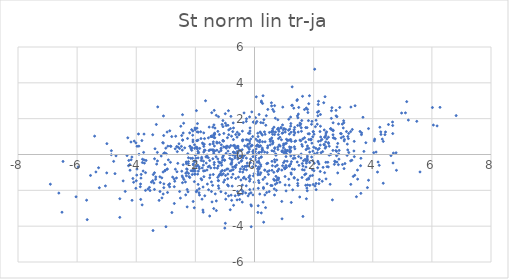
| Category | Series 0 |
|---|---|
| -3.0926707994987526 | -0.978 |
| -0.9162749100665515 | 0.935 |
| 0.9966999486311909 | 1.448 |
| 1.2450843050458609 | -1.098 |
| 0.9362940258760277 | 1.183 |
| 3.1901586718487014 | 0.109 |
| -1.0965026487906275 | 1.675 |
| 0.7906719478996074 | -0.895 |
| 1.744740184185364 | 0.271 |
| -4.068940276454976 | 0.749 |
| -2.081401741169082 | 0.704 |
| -2.1785153347138237 | 0.457 |
| 2.659842788497656 | 1.325 |
| 2.8475419634478856 | 0.032 |
| -0.801776660384526 | 0.498 |
| -2.8710928835645593 | -1.637 |
| 0.29314118956790214 | 1.766 |
| 2.418532799355688 | 0.43 |
| -0.16421413494057724 | 0.755 |
| 0.2949022909372756 | -2.66 |
| 3.488377289071174 | -1.375 |
| -0.036688486482199245 | -1.194 |
| 2.936846776467429 | 1.159 |
| 2.0009657540962804 | 0.408 |
| 4.160434861464305 | -0.98 |
| 4.1806092714659 | -0.422 |
| 3.1534068934555117 | 0.255 |
| -2.9540658687162535 | -0.816 |
| -2.827269400215396 | 0.453 |
| 1.47981580938142 | 1.253 |
| 2.0716312120821865 | 0.35 |
| 0.055061912981959615 | 0.307 |
| -5.679233010142194 | -2.551 |
| 0.15906534677144357 | 0.442 |
| 4.616365492809395 | -0.061 |
| 2.9702830837812675 | 1.695 |
| 1.2487916294620618 | -0.4 |
| -3.4326553061089182 | -4.244 |
| -1.054532323913878 | -1.078 |
| 2.4199131956516027 | -1.362 |
| -1.5611053232029057 | -0.181 |
| -1.3943211920148286 | -1.115 |
| 1.8309854679170927 | -1.318 |
| -0.7165799143362754 | 0.13 |
| -3.685817004386066 | -1.013 |
| 0.0017235221077829266 | -0.094 |
| 0.5541114000969207 | -1.728 |
| -0.03727486929783819 | 0.047 |
| -4.3733838262757025 | -2.06 |
| -1.0657559082977865 | 0.752 |
| -2.09259261048763 | -0.918 |
| 2.2162502750806663 | 1.28 |
| -3.1969976155143494 | -2.065 |
| -1.999824619255084 | -0.038 |
| 4.412817049828758 | 1.108 |
| 0.6151432422167069 | 1.124 |
| -2.005219699886686 | 1.384 |
| -2.4400107005875142 | 0.244 |
| 1.3434511516231833 | 1.388 |
| 3.402226551213407 | 2.721 |
| -0.6674165989653122 | 0.1 |
| 2.418118287628035 | 1.196 |
| 0.3827891145701443 | 1.632 |
| 0.2737817421690245 | 2.848 |
| -1.9774135845563752 | -0.378 |
| -2.2310380254989806 | -1.056 |
| -1.945528351687642 | 1.47 |
| -2.028545685223895 | 0.54 |
| -2.9828471603936073 | 0.039 |
| -0.2163692318718864 | -2.31 |
| 0.9444491729350846 | 0.206 |
| -5.658978879733441 | -3.636 |
| 6.176503859395895 | 1.595 |
| 3.1864898728304984 | 1.173 |
| 1.076023359525685 | 0.626 |
| -3.088444359839438 | -2.206 |
| 1.9327578319718821 | -0.142 |
| 1.3434612173054354 | -1.285 |
| 3.1760225862824463 | 0.888 |
| 2.4818017243720387 | -0.434 |
| 1.7941090892789866 | 2.517 |
| -3.084884541980329 | 0.64 |
| -0.6652760092727652 | -0.194 |
| 0.08746706857545039 | -0.43 |
| -1.913377909945618 | 0.177 |
| -2.4928099682610885 | 1.576 |
| 1.236693183751723 | 1.238 |
| 2.189349925229653 | 0.337 |
| 1.0684862487315705 | -2.032 |
| 2.7503120281191658 | 0.217 |
| 1.0392957054508916 | 1.252 |
| 0.3736046391093968 | -2.966 |
| -0.2745656718153846 | 0.826 |
| -3.000380516518021 | 0.353 |
| -4.840933654792393 | 0.212 |
| 0.7924873888506934 | 0.278 |
| -4.998764531331005 | -1.027 |
| 2.605911321082658 | 1.393 |
| -0.4096985947930145 | 1.303 |
| -0.5809165013321547 | 1.239 |
| -0.7200250694453754 | 1.759 |
| -2.277577374686558 | -0.83 |
| -1.694387346186157 | 0.243 |
| 1.9436192408645114 | 1.849 |
| -3.365400327468949 | 0.32 |
| -1.0684384291798983 | 1.895 |
| -2.871131993256812 | -1.803 |
| 2.5825225081376253 | 0.006 |
| 3.3085352812804985 | 1.397 |
| 0.9250387659933912 | 0.188 |
| 1.1602505312363602 | -1.378 |
| 0.2086719772624681 | -0.569 |
| -0.6485003090020331 | 0.398 |
| 0.353632867739055 | -0.873 |
| -1.962240825209105 | -0.665 |
| 1.1837039806012672 | -0.651 |
| 6.050610072918861 | 1.643 |
| -0.3970949293626802 | -0.982 |
| -1.0413751564333866 | 0.425 |
| -0.10817651718244825 | 0.486 |
| 2.152408223408094 | -0.438 |
| 2.386909557324797 | 3.226 |
| -3.7925889468134413 | -0.448 |
| -2.2938520058948413 | -0.802 |
| 0.2135336760436779 | 1.78 |
| 1.9908359137824316 | 1.28 |
| 3.597841657171715 | -2.17 |
| 3.3919826214156945 | -1.159 |
| -2.7940245874954073 | -3.24 |
| -0.3711997966377103 | -0.067 |
| 0.2741033004885898 | 0.234 |
| -0.7135752166122638 | 0.833 |
| 0.5485506287383073 | 0.825 |
| 0.22666142084594654 | 1.173 |
| 2.236579944657361 | 0.769 |
| -1.7447800592354392 | -3.099 |
| -3.863085919629471 | -1.799 |
| 1.2242712394088642 | -0.528 |
| 0.7385585674096253 | -2.002 |
| -3.343997658147739 | -1.378 |
| -0.3933988625654541 | -0.186 |
| -1.1284664536202378 | -0.955 |
| -0.22359493582846213 | 0.815 |
| -1.4366724403732842 | 0.267 |
| -0.06756315450284056 | -0.687 |
| 2.1943965569277903 | -1.394 |
| -0.5154505955138102 | 0.231 |
| 0.1358831378083094 | -1.458 |
| 0.6834004060841803 | 0.332 |
| -0.3312521385486118 | 0.484 |
| 2.291104207295362 | -1.492 |
| 1.2922467361653167 | -1.973 |
| 1.7905762822145244 | 0.477 |
| 1.364417113481326 | 0.73 |
| 0.10613770384204813 | 0.513 |
| 0.21020716058841238 | -0.66 |
| -1.2674439048753054 | 0.634 |
| -0.9616961738943441 | 0.061 |
| -1.2172576740039212 | 2.111 |
| 1.0382747028738981 | -0.776 |
| -0.4471825654070898 | -0.376 |
| 1.7848178891471678 | -2.024 |
| 0.23543798677968653 | 0.137 |
| -1.3786301036787503 | -3.018 |
| 0.6578117390687828 | 2.402 |
| -1.861395448059259 | -2.263 |
| 3.6689667108698254 | 2.078 |
| -2.3036267344713535 | -1.189 |
| -2.459575046339382 | -0.932 |
| -0.777776789916917 | -1.278 |
| 3.4836107242657377 | -0.869 |
| -1.552546153015859 | -1.968 |
| 1.1339019468435705 | 0.801 |
| -0.40847963863067704 | -0.678 |
| 0.06046067798407062 | 3.218 |
| -0.1925955027744699 | -1.274 |
| -2.5942778898746797 | -0.493 |
| -3.1048146962085736 | 0.66 |
| -0.5805122700448679 | 0.449 |
| 1.7508758500855244 | -0.356 |
| 0.4388193923076038 | -0.961 |
| -1.3678733284616431 | 0.951 |
| -5.9628560855725254 | -0.698 |
| -0.901470569125558 | -0.803 |
| -4.764657389781026 | -0.384 |
| 2.6593110506027147 | 1.77 |
| -3.282507383926342 | -0.359 |
| -0.16020660216980787 | -1.181 |
| -0.18084527852649845 | -2.197 |
| 1.8330809603121097 | -1.369 |
| 0.5221170537410096 | 0.841 |
| 1.7970815343504913 | -1.7 |
| 1.17292196964301 | -0.622 |
| 3.588700451080916 | -0.625 |
| 2.1226678925535643 | 0.094 |
| 2.526009653344789 | -0.036 |
| -0.29979699255330416 | -2.145 |
| -1.3603579935288765 | 1.154 |
| 1.0375277096782565 | -1.699 |
| 0.8688689054165062 | 0.471 |
| -3.3389978300685703 | -1.25 |
| -0.14081204260060431 | -0.457 |
| 1.9590734917875432 | -0.843 |
| 2.1307338212170404 | 2.355 |
| -1.68123466323698 | -2.306 |
| 0.7895573281098098 | 1.94 |
| -3.8400515848886734 | -1.318 |
| -0.5641963797529232 | -0.176 |
| 1.7714859748637588 | -1.873 |
| 5.2046381637172185 | 1.92 |
| -1.9215379247785398 | -0.599 |
| -1.4470036533683812 | 2.332 |
| -0.9542742554998451 | 0.352 |
| -2.9954504984303885 | -4.032 |
| -1.1208144628210333 | 0.539 |
| -1.9290729504781172 | 1.724 |
| 0.6804322178722586 | 2.727 |
| 0.6044986171901625 | -0.625 |
| -2.302696804380087 | -0.512 |
| -1.5157870868667223 | -3.435 |
| 0.3100298755262916 | -3.778 |
| 1.0099293298772452 | -0.735 |
| -4.011302511949199 | 0.65 |
| 0.15420413166604696 | -1.575 |
| -2.029884175177094 | -0.366 |
| 0.615666487525548 | 0.749 |
| -3.385112772389096 | -1.951 |
| 2.2295712685288143 | 1.577 |
| 0.34159593108077146 | 0.136 |
| -2.949545917631058 | -0.813 |
| -0.22445900138838226 | 0.56 |
| 0.6589354659350244 | 0.177 |
| 0.1499160097018688 | -0.815 |
| 1.6901990653921617 | 2.51 |
| -0.7264110348241681 | -0.037 |
| 1.082580733070019 | 0.848 |
| 1.2594781454461552 | 2.742 |
| 0.15802067872762304 | -0.459 |
| 1.2093713037165568 | 0.138 |
| -1.3841968863474667 | 0.163 |
| -1.940830369574452 | 0.772 |
| -0.3292408760625012 | -0.674 |
| 0.8595290220808263 | -1.549 |
| 1.8389421570179376 | 0.837 |
| 0.4503954775214689 | 0.483 |
| 0.7790574043441243 | -1.317 |
| 0.21413503569178882 | -1.019 |
| 2.1436464809460434 | 2.16 |
| 0.44156387617173287 | 0.372 |
| -4.5567065832026605 | -3.51 |
| -4.993090771027132 | 0.606 |
| -2.2560715851856497 | 0.039 |
| 3.0226329134961647 | 1.77 |
| 1.6319499988930861 | 0.863 |
| -1.7172887921589162 | 1.206 |
| 2.0851335595911653 | -1.963 |
| 0.9381689462920795 | 0.148 |
| -1.5157117984807078 | -0.339 |
| 2.411772816142852 | 1.082 |
| 6.27520577256114 | 2.631 |
| -1.3572305243676697 | 0.474 |
| -1.5004087154544727 | -1.144 |
| 0.5835120165597667 | 0.925 |
| 0.7707206624188112 | -0.597 |
| 0.3029322506407217 | -1.837 |
| 0.6592428776466619 | 1.526 |
| 2.909980676812215 | 1.172 |
| -0.7543246022046519 | -1.764 |
| 0.7282872528427449 | 0.002 |
| 0.22840839424667791 | -0.147 |
| -3.2736469885639394 | 2.657 |
| 1.160075190798623 | 1.969 |
| -1.6689146096799021 | 0.233 |
| 2.776699952146137 | 0.174 |
| -1.2716874031708931 | 0.238 |
| -3.6676006853219096 | -0.333 |
| 1.5824268925993366 | 1.494 |
| -1.2180093907433829 | -1.459 |
| -3.1308727067718456 | -2.424 |
| 1.6910888484617361 | 0.933 |
| 0.9567978286511032 | 2.644 |
| 1.913098428915177 | 0.86 |
| -1.7670110428076162 | -0.751 |
| -0.9785281066166718 | -1.17 |
| -2.799957709822544 | 0.999 |
| -5.042481201374993 | -1.753 |
| -2.5061111057130327 | -2.433 |
| -0.5411618985105706 | -2.259 |
| 1.0639459891870713 | -0.618 |
| 1.5368223790786786 | 1.751 |
| -1.043894604678087 | -1.543 |
| 0.6722541843440251 | -1.444 |
| 1.0657709166066711 | -0.116 |
| -1.1987123364061727 | 0.141 |
| -0.9862193956581287 | -3.839 |
| -0.9124139071137476 | 0.455 |
| -0.1203390713851995 | -2.134 |
| -0.43200194373533485 | -0.338 |
| 0.06321055964088096 | 0.477 |
| -0.458408804927819 | -1.424 |
| 1.0788199275734147 | 0.053 |
| 0.027927784863527094 | -0.301 |
| -2.0164478744380894 | -1.104 |
| 2.0807616088651395 | -1.618 |
| -2.3089454324640935 | -0.418 |
| -4.088600298249874 | -1.55 |
| -1.4559713142080675 | -1.528 |
| -2.186198032036029 | 0.459 |
| 1.5872522205134132 | 1.295 |
| 2.2310763456442757 | 2.232 |
| 0.0348350727269775 | 2.056 |
| 3.5693898781138893 | 1.287 |
| 3.3763953342799713 | -0.121 |
| 0.7258650928060826 | -1.218 |
| -1.729250011119877 | -0.593 |
| 2.1443601898051075 | -0.379 |
| -2.4625195207676835 | 1.058 |
| 3.0335333127713646 | 0.758 |
| -1.7140170328191058 | 0.45 |
| 0.947843178733919 | 1.651 |
| 1.777920426700689 | 1.5 |
| 1.4658521202718475 | -1.737 |
| -5.546615065505398 | -1.169 |
| 0.8995984369288443 | 1.476 |
| -0.5899015085918471 | 0.966 |
| 0.11706510735660292 | -1.136 |
| -0.5896979048262869 | -2.534 |
| 6.017872490577978 | 2.621 |
| 0.9827500223069219 | -0.457 |
| -3.603701642354663 | -1.927 |
| 0.6238960536632145 | 0.658 |
| -1.611066785989446 | -0.141 |
| 0.18117044338429533 | 0.801 |
| 1.754896525281028 | -2.47 |
| -0.5010862305513903 | -2.224 |
| 1.965544452706423 | -0.342 |
| -1.4093953273961626 | 1.529 |
| -3.97569908199916 | -0.814 |
| 0.5922576356002907 | 0.21 |
| -2.1495094707903455 | 0.322 |
| 0.98036952864057 | 0.368 |
| -1.1870608325481289 | 1.113 |
| 1.0399468805555419 | 0.263 |
| -0.07941216317560063 | 0.512 |
| -1.7177306696789376 | 0.137 |
| 1.2239223788683873 | 1.582 |
| 0.12194247063156105 | 1.003 |
| -0.41373654701335383 | -2.657 |
| 0.12813309450164834 | -1.888 |
| -1.3403008460425143 | 0.207 |
| 0.41028424069943803 | -2.123 |
| -2.0342214219621395 | -1.515 |
| -3.029067087291123 | -0.562 |
| -2.021215624459203 | -1.09 |
| 0.12435091710826374 | 0.454 |
| -1.478173412092378 | -0.75 |
| -1.9461381262714825 | -2.01 |
| -0.15048731404627969 | 1.485 |
| -1.3438568436983367 | 0.935 |
| 3.1109244138746117 | 1.281 |
| 2.2508632756722173 | 0.103 |
| -2.9073000459258225 | -1.694 |
| 2.757483976805543 | 2.463 |
| 0.9316199880891105 | -3.591 |
| 3.252861546033526 | 1.279 |
| 1.2380255754422196 | 0.395 |
| 0.17872844196376825 | -2.208 |
| 0.23297823312344867 | 2.983 |
| -0.27924230462068067 | -1.75 |
| -1.291099339093229 | -2.591 |
| 0.7773903610774431 | -0.935 |
| -1.9419375429878896 | 0.386 |
| -0.02308548155775192 | 1.823 |
| -1.1095333318523712 | -0.597 |
| -0.33404793308435554 | -0.041 |
| 2.8377981916456356 | -0.568 |
| -0.6528765188340406 | -2.304 |
| -0.7205808997984677 | -0.847 |
| -0.15204130225766388 | 1.31 |
| 1.8148385114625007 | 1.156 |
| 4.97610219708406 | 2.314 |
| -1.3776073734286012 | 0.071 |
| 0.08244810574405825 | 1.839 |
| 1.189095639982634 | 0.811 |
| -2.553943287133489 | 0.597 |
| -0.8966042710543798 | 0.188 |
| 0.7149171252964877 | 0.037 |
| 0.4723643331402645 | -1.112 |
| 2.1421689631506364 | 0.274 |
| -0.9844867980656735 | 1.748 |
| -1.0528142141626686 | -0.053 |
| -4.684389815095251 | -0.074 |
| -0.5568827701500565 | 0.462 |
| -1.9703386964154248 | 0.411 |
| -2.051419979629724 | -0.919 |
| -1.6560483491156122 | 2.999 |
| -1.06865224822233 | -0.125 |
| -4.311595726575079 | -0.058 |
| 1.8592829213353532 | 3.281 |
| -3.135104254413285 | -1.305 |
| 0.6685179774594605 | -1.918 |
| -1.515567923409825 | -1.302 |
| -0.9747105824822437 | -2.164 |
| -0.7983437017287436 | -0.529 |
| 0.3452867572299283 | -0.872 |
| 3.618171152135665 | 1.108 |
| -0.41714211891072317 | 0.267 |
| 0.5784035252069826 | 2.711 |
| -2.2498999715956725 | -2.083 |
| 4.271849809841286 | 1.262 |
| -4.261832242560523 | -0.624 |
| 2.4474394631356393 | 0.865 |
| 0.5919174175827031 | -0.884 |
| -2.428483705938377 | 0.811 |
| -1.7874213401673762 | -0.156 |
| -3.99896803051495 | -1.467 |
| -0.013202192720139116 | -0.52 |
| -6.618263983652319 | -2.153 |
| -1.5590332461273064 | 0.929 |
| 0.5319365598311219 | 0.539 |
| 1.1502205079843169 | 1.356 |
| -0.03860294750259374 | 0.228 |
| -1.3003193621714226 | -0.129 |
| 2.34818827795253 | 0.56 |
| 1.7889382159727223 | -0.091 |
| -3.5330215354291976 | -2.012 |
| -2.0960979446545505 | -0.211 |
| 1.4523614243059644 | 2.158 |
| -0.706061817421908 | 0.128 |
| 3.1320054398677994 | -0.047 |
| -1.9122140866518276 | 0.035 |
| -1.108364017980544 | -1.14 |
| -0.6762912369289262 | 0.509 |
| 2.652453183033942 | 0.229 |
| 3.8568963829197305 | 1.445 |
| -1.6986521833948753 | 0.575 |
| -1.4569492209579353 | -2.067 |
| -0.012674113932364506 | -1.07 |
| -1.2426395325484503 | -0.244 |
| -2.084708740082588 | 1.312 |
| -0.6349191694092493 | -1.338 |
| -2.067540379384342 | -0.525 |
| 2.1781866679346162 | -1.626 |
| 3.0289988682011417 | -0.787 |
| -2.1262766742635675 | 1.386 |
| -2.8446581865728886 | 0.465 |
| 4.676673511025209 | 1.167 |
| -0.8206962558184685 | -3.083 |
| -2.5333907149797126 | -2.066 |
| 1.5303126415876278 | -2.372 |
| 1.6071859385608782 | -1.284 |
| 1.638369630892452 | -3.456 |
| 4.669736450620842 | 1.812 |
| 0.10306309077342668 | 0.762 |
| 4.531476354145555 | 1.673 |
| 1.620434880952983 | -0.846 |
| -3.97350636646264 | 0.459 |
| 0.23054768812280813 | -3.261 |
| 1.3682190708196842 | -0.206 |
| -1.206953337237998 | -1.887 |
| 1.782119522720028 | -0.364 |
| 0.9234765916094929 | -0.871 |
| 0.5765848465176848 | 1.25 |
| 1.6827883252212636 | -0.865 |
| 2.814893092796038 | -1.028 |
| -0.49323515112042404 | -0.063 |
| -0.8140195810152049 | 1.447 |
| 4.788889543937667 | 0.096 |
| -3.8499641933038324 | -2.507 |
| 1.4626185473012487 | -1.418 |
| 4.054969274066702 | 0.761 |
| -3.4021513357141524 | -1.594 |
| -2.3237728657948544 | -1.043 |
| -3.736869761223222 | 1.14 |
| -3.186540172299182 | -1.565 |
| -2.4346423531055543 | 2.222 |
| 1.2253330153107385 | -0.081 |
| 0.5038975610766228 | 1.23 |
| -0.12444216363201832 | 0.869 |
| -1.2255536881491675 | -0.643 |
| 2.700933621549134 | -0.551 |
| -3.808822251638878 | 0.778 |
| -2.0205525383869753 | -0.788 |
| 3.3729146340953635 | 0.734 |
| -3.924129436708197 | 1.144 |
| -0.6616632695887468 | -0.66 |
| 1.18034911183614 | 1.14 |
| 1.0836563012413656 | -0.718 |
| -0.973568024513729 | -2.494 |
| 2.3645122692302776 | 0.533 |
| 2.5812023239782365 | 1.443 |
| 3.2614044956069987 | 2.648 |
| -2.0742404108244115 | -2.623 |
| -3.2263942972867232 | -2.561 |
| -0.040882102686392585 | 1.802 |
| -0.12174595708379687 | -2.809 |
| 0.6787382168720537 | -0.291 |
| 1.6977490406677793 | -1.128 |
| -4.178330122843313 | 0.698 |
| 2.0103354399877107 | -0.905 |
| 1.9851850037798826 | -1.675 |
| 0.2706289491348315 | 0.712 |
| 0.6796116166204653 | 1.116 |
| 1.8717774163728356 | -1.722 |
| 0.4253749452751343 | -1.634 |
| 0.12215906609081095 | -0.935 |
| 2.7764562808696596 | -0.07 |
| 1.6008634367824843 | 0.555 |
| 1.8660751180803627 | 0.136 |
| 1.9722004883911 | 0.991 |
| 2.3057793149513275 | 0.161 |
| 1.0415212794579904 | 0.148 |
| -3.7507842400927345 | 0.119 |
| -0.8295084024180124 | -0.915 |
| -2.2774398804691964 | -2.924 |
| -1.2118439356905633 | -0.409 |
| -0.28255887559572823 | -0.657 |
| -2.1560385588658653 | -0.216 |
| 1.2245397174190016 | 0.835 |
| -0.060733059174674864 | 1.003 |
| 0.35226405211469025 | -1.275 |
| -1.3484392328069141 | 1.132 |
| -0.500953495210732 | -2.511 |
| 2.28032249399769 | 0.838 |
| 1.7332038638528982 | 1.501 |
| 1.9126667458630706 | 0.821 |
| 2.733664544865529 | 0.879 |
| 0.09862442410981664 | 0.527 |
| -1.1654883933596665 | -0.451 |
| 2.7889137097322276 | 2.108 |
| 3.0603054015125233 | -0.505 |
| -2.640058838981483 | -1.31 |
| -2.5336536751254304 | 0.336 |
| 0.7555666401592926 | -0.307 |
| 2.8636892221995964 | 0.228 |
| -4.172866819434566 | -0.294 |
| -0.5303934930820056 | 1.095 |
| -0.11186882738012471 | -4.031 |
| 1.566922368060574 | 1.707 |
| 0.7753764891236274 | 1.408 |
| 0.7388564543707368 | -1.443 |
| -0.7379624068057327 | -0.696 |
| 0.4967272822952502 | -2.071 |
| -2.234646571794878 | -0.181 |
| 2.44092344142312 | 1.264 |
| -0.38058418532561067 | 1.78 |
| -0.553388805135894 | 0.357 |
| -5.408445170276721 | 1.025 |
| -0.3515011539747599 | -1.265 |
| -2.3369789187734 | -1.534 |
| -0.44008012018642884 | -1.976 |
| -1.1329401912261288 | 0.313 |
| 1.0249052090261968 | -0.798 |
| 4.674274436399399 | 1.618 |
| 0.8104990050251928 | 0.887 |
| -1.0362399681181467 | 1.176 |
| 2.7922315801556152 | 0.422 |
| 1.790744374319602 | -0.302 |
| -0.14492950586471753 | -1.375 |
| 1.034936127516504 | 0.6 |
| 0.14234108351228425 | 0.097 |
| -0.7729993141743989 | -2.558 |
| -2.6312685301617575 | 0.448 |
| 0.6901899355957415 | -0.416 |
| -2.4467801757679153 | -1.198 |
| -3.200576188424762 | -1.245 |
| 0.6549456247465173 | -0.996 |
| 1.3489030382867666 | 0.431 |
| -1.2931138467906678 | 2.187 |
| -0.36316696534281956 | -0.826 |
| 3.0029454856515736 | 1.483 |
| 4.685900426751484 | -0.474 |
| 2.08335682372026 | 1.914 |
| -0.4945440737317206 | -0.959 |
| 0.8183357893175724 | -1.313 |
| -4.146690195834897 | -0.142 |
| -0.7674228749648977 | -0.426 |
| -1.6776713122661722 | -0.907 |
| -2.1060134135632342 | -1.121 |
| -3.7383139097604516 | -0.302 |
| -1.5326904567618858 | 1.53 |
| 4.3545398932704895 | -1.604 |
| -0.9413489086401405 | -0.823 |
| 1.8249051688565823 | 1.892 |
| 1.4682436130318326 | 2.048 |
| -0.78970258573184 | -0.54 |
| 0.9829528195978847 | 0.586 |
| -0.23579462507050053 | 0.088 |
| 5.106124113301707 | 2.324 |
| -1.4171828830482207 | -1.72 |
| 1.0516990536639206 | 1.402 |
| 0.806563348305974 | -1.411 |
| 5.14922657495759 | 2.951 |
| 0.9107913178507614 | 0.821 |
| 0.8201080315297693 | 1.401 |
| -6.4769453846559095 | -0.387 |
| 2.81447352796401 | 0.618 |
| -2.6224393071862133 | -0.963 |
| -0.4715443034902478 | -0.091 |
| -2.193157628391875 | 1.206 |
| -3.079942343875606 | 2.152 |
| 3.622432057014227 | 1.208 |
| -1.6042017822928756 | -0.029 |
| 3.2940131552449072 | -0.32 |
| 1.9424078705232866 | 0.632 |
| 2.55850855536558 | -1.662 |
| -1.8692331181389141 | -1.912 |
| -0.7511804286994002 | -0.29 |
| -1.8983636567257598 | -0.926 |
| -3.6876278550145907 | -2.004 |
| -1.2387709349443456 | 1.291 |
| -4.2101386293025005 | -0.878 |
| -0.7107058975114464 | 1.481 |
| -1.7352522494052227 | -3.22 |
| -1.3916533703812144 | 0.707 |
| 0.15601807275106516 | 2.234 |
| 0.7624304876290848 | -1.591 |
| 0.11551361255227022 | -3.234 |
| -0.8510531412287659 | 0.398 |
| -0.9831036931925681 | 0.404 |
| -0.20557032759955085 | 0.383 |
| -1.3781040596025154 | 1.101 |
| -0.8073325572833348 | -0.005 |
| -1.1220865732365608 | -0.462 |
| -0.5218312588782723 | -0.461 |
| -0.3742953883628033 | -1.317 |
| -0.7362163059349172 | 1.278 |
| -2.239552804028902 | -0.51 |
| 0.8975262295557807 | 1.505 |
| -0.7752265578162998 | -0.283 |
| 0.06543744814661157 | -0.001 |
| 0.16141085405615296 | -0.77 |
| 2.161446381502862 | 0.732 |
| -2.7692943556850356 | -1.262 |
| 2.572269370867609 | 1.437 |
| -1.502218563622951 | 0.264 |
| -0.15942172269084232 | 1.176 |
| -1.1568735796126015 | -1.068 |
| 1.7521377713627935 | 2.593 |
| 1.7552106866593347 | -0.481 |
| 0.19154648946316133 | 1.258 |
| -3.0327661014837908 | -0.915 |
| 2.882189828331331 | 2.627 |
| 1.4609326239567206 | -1.616 |
| -0.7801082746235686 | -0.521 |
| -3.3091800650502847 | -0.536 |
| 0.7248939447885974 | -0.044 |
| -1.3622820554601636 | 2.463 |
| -1.906218639304809 | -1.669 |
| 4.431859766450172 | 1.258 |
| -1.8105516540056028 | 0.889 |
| -1.7112949192924312 | -1.238 |
| -1.08112964239763 | -0.321 |
| -0.16667270287497704 | -1.487 |
| -4.555245594155437 | -2.468 |
| -0.128338653927476 | 0.461 |
| -0.8977108262261009 | 1.629 |
| 1.9740328841838632 | 0.185 |
| -1.6067735473450409 | -0.868 |
| -2.4717964737351927 | 0.454 |
| 0.8035250033461656 | 1.465 |
| -0.7771395171075897 | 1.022 |
| 1.1867499700390765 | 0.423 |
| 0.8604366795730982 | 0.961 |
| 3.5994788069463057 | -0.212 |
| 1.4361263119288061 | 3.014 |
| -6.036173830251457 | -2.361 |
| -1.1294328179881434 | 0.353 |
| -0.5426501674997786 | -1.263 |
| -1.1364827653134553 | -2.077 |
| 2.1820423227494556 | -0.532 |
| 2.0353273187389846 | 4.76 |
| 1.1176222819901396 | 0.77 |
| 1.2218700488330692 | 2.089 |
| 1.2348486880357008 | -1.028 |
| 0.10563515669863754 | -0.795 |
| -0.8718232373224337 | 1.372 |
| 1.6414585498386716 | -0.647 |
| 4.6987716632639405 | 0.078 |
| 1.7318157628214177 | 0.693 |
| -3.5541212201834806 | -1.837 |
| 4.033855398089549 | 0.102 |
| 1.8873087378887128 | -1.196 |
| 0.1406385405388315 | -0.375 |
| 0.6378158336719331 | 1.282 |
| -1.044564196541021 | 0.752 |
| -2.681800589750038 | 0.318 |
| -2.360211959028123 | 0.37 |
| -3.038479369227316 | 0.093 |
| -0.3873122931241184 | -2.068 |
| -2.665458837856532 | 1.02 |
| 3.015484408420347 | 1.883 |
| 0.28857396251760115 | -1.392 |
| 2.238974254122625 | 0.976 |
| 1.732297362409998 | -1.715 |
| 1.3401391651562342 | -0.044 |
| 0.9808249390961334 | 0.495 |
| -0.8357634872885127 | -0.215 |
| -1.96908553124507 | -2.078 |
| 2.1707592975909815 | 2.408 |
| -1.7592285619275128 | 0.64 |
| 3.7667288905562284 | 0.657 |
| 1.617170469148495 | -0.506 |
| 3.0075940735105906 | 0.997 |
| 2.0234252031634234 | -0.49 |
| -2.4359767398772307 | -1.573 |
| 1.4490587669196433 | 3.062 |
| 2.0489335291341133 | -1.761 |
| -1.0917248731333205 | -0.893 |
| -3.0723014179489736 | 1.059 |
| 1.658238382955207 | -0.347 |
| -1.354049056360684 | -0.746 |
| -1.9032595963403196 | 1.246 |
| -3.0647182717791317 | -1.639 |
| -2.0228872156050697 | 0.344 |
| -2.082138570201489 | 0.81 |
| -0.8772071616721 | -2.312 |
| -1.9080595237914046 | -0.189 |
| 0.8278713386693637 | 1.291 |
| 1.1034524983751828 | -0.378 |
| -1.2254598622063186 | -1.457 |
| 5.59848198213713 | -0.973 |
| -1.5679733552788848 | -0.687 |
| -6.5118354635978895 | -3.222 |
| 1.1202068436493766 | 0.221 |
| 0.35918092507701793 | 1.126 |
| -0.4740400948375081 | -0.808 |
| -2.8439268186157864 | -0.436 |
| -2.8652904237749786 | 1.322 |
| -2.913771765733186 | -0.3 |
| -0.20180825302912986 | 1.186 |
| -3.76716381910924 | -0.922 |
| -0.054050465539744685 | -0.122 |
| 1.2451770699458677 | 0.733 |
| 0.5911621028286982 | -0.382 |
| -0.7756984403803466 | -0.884 |
| 3.3418032754181803 | -1.225 |
| 2.3724694493969505 | -1.015 |
| -0.6479168948388914 | -0.08 |
| 2.1644086008254844 | 2.97 |
| -1.4579241476268976 | 1.031 |
| -1.4085038468006914 | -0.236 |
| -3.7881201377087876 | -0.266 |
| -2.1226767195695446 | 0.234 |
| 0.5721979814969185 | 2.885 |
| -0.5656953500800332 | -0.247 |
| -2.4312755240295125 | 0.8 |
| -1.274734788362041 | 0.692 |
| -1.933814580570984 | 0.311 |
| 0.9774340886083754 | 1.378 |
| 2.7325838596012737 | -0.412 |
| -1.8773062286601885 | -2.133 |
| -0.17206818006595714 | 0.3 |
| 1.6194299450042866 | 0.46 |
| -0.13209077405172653 | -0.257 |
| -0.2735433875966917 | -0.201 |
| -0.35710685450869395 | -0.82 |
| 1.1899190505320112 | 1.414 |
| 2.635797740143408 | -2.534 |
| -0.050760105567619895 | -2.253 |
| 1.0196930903241395 | -0.367 |
| 0.7041020244660032 | -1.664 |
| 4.06403034009377 | 0.856 |
| 0.01665488353520672 | -0.156 |
| -4.4429850120468775 | -1.474 |
| 0.35003965195966913 | -2.255 |
| 2.124079855061985 | 1.69 |
| 2.5067130660669488 | 0.614 |
| -0.10473505537260053 | -2.872 |
| -2.423668855912089 | -1.284 |
| -1.8623231011377008 | -0.785 |
| 1.5736321557729571 | -0.198 |
| 2.1552593653279084 | 2.79 |
| -1.009421746220668 | -0.325 |
| 1.0964786557374397 | 0.206 |
| 2.7897836584819746 | -0.42 |
| -1.8024692068428347 | -0.335 |
| 0.18564104386344926 | -1.121 |
| 0.6482164106891357 | -1.38 |
| -3.8331986701260403 | -1.113 |
| -1.9227413640272433 | -1.097 |
| -1.0095599072458743 | -1.426 |
| -1.3471836647934419 | 1.189 |
| -0.8716493737817217 | 1.105 |
| 1.8352412067044046 | 2.836 |
| 0.4503629971479448 | 2.517 |
| 0.28915628202098453 | 3.279 |
| 0.7079046816420798 | -0.667 |
| 0.35815447960713875 | 0.709 |
| 0.22867600940578736 | -0.137 |
| 3.156390322973122 | 1.006 |
| -1.8534073104434636 | 0.341 |
| -4.719313889712731 | -1.068 |
| -3.3804784847246543 | -0.238 |
| 1.1731164144680744 | -1.713 |
| -1.5262767260767198 | -0.645 |
| -1.9098542801911584 | 0.805 |
| -2.213062014987363 | -1.234 |
| 1.7702518886764826 | -1.401 |
| -2.276697952283932 | -1.954 |
| -2.013371424691571 | 1.477 |
| 1.7120747622199204 | -0.277 |
| 1.838089471494139 | 0.34 |
| 1.3667223885062425 | 0.318 |
| -1.364623922388816 | -0.56 |
| -2.931484770179699 | 0.464 |
| 4.356197975311331 | 0.731 |
| -1.8086504299788215 | -1.35 |
| 1.244627473157216 | -2.676 |
| -3.2856305534237933 | 0.117 |
| 1.9850352483775362 | 1.269 |
| -4.842661231831633 | -0.011 |
| 0.592921702704885 | -1.736 |
| -4.217972824066654 | -0.566 |
| -1.734892421603389 | 0.573 |
| 0.5927721479285264 | 1.302 |
| 2.9345110914109416 | 0.933 |
| -1.06901117554842 | 0.786 |
| -1.964434179842577 | 2.449 |
| -1.6908043466293723 | 0.885 |
| 0.5344365069488939 | 0.732 |
| -1.6324486945580814 | -0.48 |
| 1.7396284925997039 | -1.078 |
| -3.8544941629077263 | -1.645 |
| -2.412292009589393 | -0.572 |
| -5.274301308385277 | -0.74 |
| -5.3643976152512005 | -0.975 |
| 0.1708804224503968 | 0.695 |
| -0.7297267952319464 | -1.102 |
| 0.7869800029181233 | 0.412 |
| -2.676330945172344 | -0.822 |
| 1.4451542469636163 | -0.42 |
| -1.1865194699730006 | 0.66 |
| -0.4104824262025746 | -1.708 |
| 2.655825023240417 | 1.1 |
| -1.2416802683716206 | -1.276 |
| 1.0583519922484852 | 0.143 |
| -0.24564566654398678 | -0.48 |
| 0.6160479696895038 | 2.513 |
| 2.3901218412993117 | 0.352 |
| 4.277859234630039 | 1.121 |
| -0.16336530154302054 | 0.624 |
| -0.7072578144042145 | -2.836 |
| -1.1683692753262171 | -0.479 |
| 2.5292202738511094 | 0.463 |
| 1.3633067485884736 | 1.207 |
| 3.700880547508037 | 0.173 |
| 0.20346508108367356 | 0.487 |
| -0.6383963945588409 | 0.346 |
| -1.9415552359275043 | 1.263 |
| -1.0041010177557137 | -4.107 |
| -2.0362902258381155 | -2.975 |
| -1.3265181003950701 | -2.199 |
| 0.4135229601373025 | -0.511 |
| -2.716452775014778 | -1.369 |
| -2.9414117540117646 | -2.118 |
| -1.36038452637891 | -0.443 |
| 1.7417098402822369 | -0.701 |
| 3.4475692636280044 | -2.356 |
| -0.5592095316401329 | 0.089 |
| 2.2250108102910566 | 0.525 |
| 0.6164031487191082 | 1.431 |
| -0.27027704207310155 | -0.652 |
| -2.6973394569970415 | -1.492 |
| -2.712406938092898 | -2.734 |
| 0.4007027738071187 | 2.166 |
| 2.40640276514854 | 0.698 |
| 1.7799368712598858 | 0.333 |
| 1.33409602973195 | 1.286 |
| 2.3598760616756618 | 1.368 |
| -1.3711979463055926 | 1.653 |
| -0.021705723099984198 | -1.927 |
| -1.9831976901454365 | -0.211 |
| -1.7262666598409346 | -0.372 |
| 3.25735207629225 | -1.666 |
| 2.034064709077567 | 0.04 |
| -0.8817520545734769 | 2.444 |
| -0.5869708114140773 | 0.168 |
| 1.3426855802492312 | -1.319 |
| 0.16350273692121053 | 0.119 |
| 1.8560095458278552 | 1.157 |
| -0.9009150887546173 | -1.093 |
| -0.4622399126545407 | 0.221 |
| -0.9882876634744573 | 2.276 |
| 2.6030163493520213 | 2.444 |
| 0.9224302732134397 | -2.619 |
| 2.6195399556683254 | 2.614 |
| 4.321949014539551 | 0.86 |
| -4.251809358617923 | -0.333 |
| -1.8769341002450863 | -0.688 |
| 1.5360779960052602 | 0.803 |
| -1.1999199070207887 | -1.169 |
| 0.7042566753208384 | 2.025 |
| 1.3937423673631795 | 0.764 |
| 0.8079366975279338 | 1.11 |
| 1.5780800943718374 | 0.028 |
| -3.4395219430220685 | -1.462 |
| 4.2181990150265225 | -0.604 |
| -0.09086396840251787 | 2.376 |
| 3.85695507419028 | -1.439 |
| 0.18134775128319447 | 0.473 |
| -0.16635726981012855 | 2.098 |
| 2.0604840556950084 | 1.552 |
| -2.5849961039958664 | 0.41 |
| -2.3269969821449275 | -2.255 |
| 0.7090327120235598 | 1.25 |
| 2.6613941321997627 | 1.359 |
| -3.9827336915356737 | -1.15 |
| 0.49786950188229273 | -0.904 |
| -3.3202946237203106 | 1.676 |
| 2.497027350903579 | -0.693 |
| 1.5033507089498697 | -0.604 |
| 1.2295957262430255 | 1.727 |
| 1.273862594090553 | 3.775 |
| -0.6234719010281697 | 0.016 |
| 0.3375036528143358 | 1.262 |
| -1.0656966551016573 | 1.554 |
| 4.1133294919487415 | 0.136 |
| -0.512652304837582 | 1.139 |
| -1.3922742348442796 | 0.252 |
| -0.8513094823896816 | -0.003 |
| 2.8425446699097945 | 1.708 |
| -6.905405292913943 | -1.657 |
| -2.2352257208835233 | -0.399 |
| 2.5002960204152958 | 0.964 |
| -1.433230184259406 | 0.994 |
| 1.310747869346553 | -0.223 |
| -3.3836361867786 | -1.018 |
| 2.974386360019456 | -0.559 |
| 0.0450806673975741 | 0.857 |
| -3.443096418918957 | 1.103 |
| 0.025794913899903626 | 0.157 |
| -2.396676397438787 | 1.745 |
| -4.142217533558653 | -2.558 |
| -4.285940322146062 | 0.93 |
| 2.0131010577558364 | 1.13 |
| -1.508360849727505 | 0.565 |
| 0.9592706141076812 | 1.211 |
| -1.1329942273362965 | 0.216 |
| 0.43067154353940573 | 0.108 |
| -0.2779636050182219 | 1.85 |
| 1.2241412203567261 | 0.204 |
| -1.1752039450990948 | -1.143 |
| -1.336234410401187 | 1.476 |
| 2.760424795322651 | 2.158 |
| 2.342106535429739 | 2.89 |
| 0.3044415084212915 | -1.898 |
| 1.1911598706305968 | 0.148 |
| -1.7869418809612707 | -0.234 |
| -0.011402153768928613 | -1.547 |
| 0.026104560276500877 | -0.184 |
| 0.0415854569467804 | 1.742 |
| 3.8206084976257255 | -1.848 |
| 3.1400223276709056 | 0.578 |
| 1.0348029198595112 | -1.227 |
| 4.240321116244035 | 1.522 |
| -1.3996337738677127 | 0.601 |
| -1.2547125324307373 | -0.764 |
| 0.9971568167360427 | 0.098 |
| -1.015888655846072 | -0.308 |
| 2.4556872962724574 | -0.681 |
| 2.6860886234456096 | 0.925 |
| -2.006665684946027 | -0.926 |
| 3.0425312980617 | 0.84 |
| -0.18794154488810033 | 0.15 |
| -1.539622540404225 | 0.218 |
| -0.6150169493478579 | -0.584 |
| -2.411979399947562 | 1.2 |
| 1.5640665516639656 | 0.765 |
| -1.0110409084724026 | -0.896 |
| -0.4048973854118323 | 0.763 |
| -1.5937295024183529 | -1.65 |
| 1.6252421463538642 | 3.247 |
| 0.9505896134094236 | -0.626 |
| 1.2776477075539123 | -0.813 |
| -3.8007825279204797 | -2.812 |
| -2.073846069746536 | -0.573 |
| -2.3885159685584654 | -1.392 |
| -3.1563240431332575 | -0.084 |
| -3.9074631034604224 | 0.015 |
| 0.15804450448236018 | -0.214 |
| 2.5990595678280215 | 2.016 |
| -2.1139186123021805 | 0.379 |
| -3.487345657751046 | -1.541 |
| -0.40308068331628455 | 0.811 |
| 1.9633193546282222 | -1.167 |
| -3.42328208107555 | -1.118 |
| -2.6119097961888906 | 0.16 |
| 2.3699524191368493 | 0.966 |
| -0.25453817387648137 | 0.465 |
| -0.9455451668025292 | 0.456 |
| -0.2920873797678283 | -1.374 |
| 6.821357257278664 | 2.171 |
| -0.6358752208020224 | 1.116 |
| -0.9114897085164388 | -1.696 |
| 0.1258501592434511 | -1.042 |
| -1.9470588090293424 | 0.769 |
| -3.9107487213959846 | 0.465 |
| 2.857275703444711 | -0.26 |
| 1.2797863841844892 | 2.747 |
| -1.7392602924374811 | -1.814 |
| -3.067602215082883 | -1.852 |
| 0.2647174701175006 | 0.358 |
| -3.7241624951857055 | -0.481 |
| 0.26451717720101264 | 1.085 |
| -2.0251967525750043 | -0.395 |
| 0.44918281563934936 | -0.488 |
| -1.2215171118021697 | -1.75 |
| -0.35383068236140947 | 2.32 |
| -0.45545805483301827 | -0.1 |
| -0.38845946900209416 | 0.816 |
| -1.2902382807212591 | -3.129 |
| 0.12481078369554055 | -2.86 |
| 0.8330203103317393 | 0.531 |
| -1.0818796360505258 | -0.183 |
| -0.27002814351254134 | -0.858 |
| -0.06092062918607066 | 0.155 |
| -2.1890799892261166 | -1.288 |
| -3.0725954179653767 | 0.057 |
| 1.1955648282262148 | 0.297 |
| -1.4745878521942961 | 1.001 |
| -1.3654547623545499 | 1.086 |
| 0.8222393543349833 | -0.811 |
| -2.281836927574698 | -0.982 |
| 0.6106008486254879 | 0.594 |
| 2.319451799890537 | -0.718 |
| -2.955688326328735 | 1.254 |
| -0.7975146236062605 | 2.128 |
| -0.2198305729725245 | -0.643 |
| 1.4607953612832976 | 1.622 |
| -0.1608973932683826 | -1.958 |
| -2.714035587325087 | -1.797 |
| -1.8203223197693879 | 1.268 |
| 4.801391431130529 | -0.883 |
| -5.248320263861786 | -1.856 |
| 1.8643236924035698 | -0.449 |
| 0.3189253802127663 | 1.945 |
| 0.2350639952898348 | 2.921 |
| 0.6870754113186868 | 0.378 |
| 1.3586671320080237 | 1.512 |
| 1.350831632314427 | -0.828 |
| 1.7848897081583033 | -0.197 |
| 1.4837757343138565 | 2.256 |
| -0.27102523540820567 | 1.995 |
| 3.3628493132311252 | 0.197 |
| -1.7744168105548752 | -2.493 |
| 3.251759259044534 | -0.354 |
| 2.712020938716149 | -0.375 |
| -4.113361974228176 | -1.339 |
| -3.0203004734915586 | -0.881 |
| 1.5984362171839095 | 1.897 |
| -0.9078950952634539 | -1.353 |
| 2.2236012595374346 | -0.946 |
| 1.9287514368349754 | 1.684 |
| 0.11166951519271251 | 1.187 |
| -1.6440426712009621 | -0.131 |
| 2.397791468418001 | 0.983 |
| 2.136485644276947 | -0.739 |
| -1.8882871024022387 | 0.107 |
| -1.4368714396273203 | -2.647 |
| -0.41064623956610546 | -2.188 |
| -0.6447256905296825 | -0.726 |
| -2.264604847955452 | 0.895 |
| 1.8059919892246512 | 2.343 |
| -2.062718945856874 | -0.814 |
| -0.8827622740469847 | -1.755 |
| 1.9001928651523325 | 0.824 |
| -4.0118692901061515 | -1.887 |
| -0.790051355616316 | -2.269 |
| -2.143312221087262 | -0.907 |
| -1.7829179008447404 | -1.414 |
| 1.3288202217169056 | 2.586 |
| 1.337052487131781 | 1.094 |
| 0.6773212782753459 | -2.261 |
| -2.090591685289599 | 1.076 |
| -0.5734415893370581 | -2.069 |
| -1.7241536167419875 | -0.918 |
| 2.666389722302763 | 0.933 |
| 5.489939014042433 | 1.851 |
| 1.4920635965924314 | -0.112 |
| 1.495879896945599 | 2.628 |
| 0.037127462988571835 | -0.633 |
| 2.4997698539589983 | 0.667 |
| 1.5373929246904483 | 1.622 |
| 2.4134513437139127 | -0.436 |
| -0.7141110976722782 | 0.494 |
| 0.13347497243743955 | -0.695 |
| -0.9570478808856606 | 1.616 |
| 0.2616384974198853 | 0.273 |